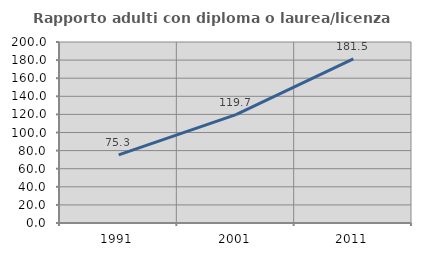
| Category | Rapporto adulti con diploma o laurea/licenza media  |
|---|---|
| 1991.0 | 75.333 |
| 2001.0 | 119.675 |
| 2011.0 | 181.452 |